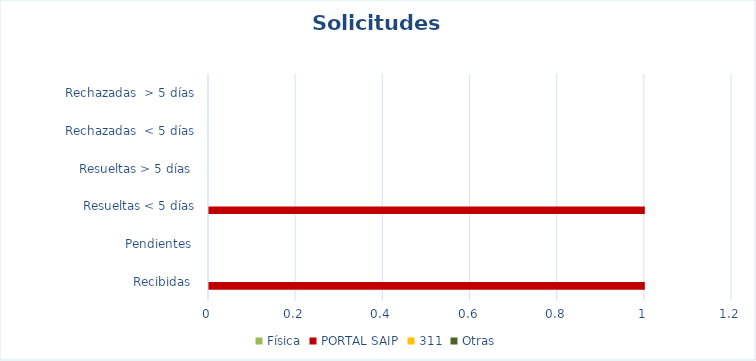
| Category | Física | PORTAL SAIP | 311 | Otras |
|---|---|---|---|---|
| Recibidas  | 0 | 1 | 0 | 0 |
| Pendientes  | 0 | 0 | 0 | 0 |
| Resueltas < 5 días | 0 | 1 | 0 | 0 |
| Resueltas > 5 días  | 0 | 0 | 0 | 0 |
| Rechazadas  < 5 días | 0 | 0 | 0 | 0 |
| Rechazadas  > 5 días | 0 | 0 | 0 | 0 |